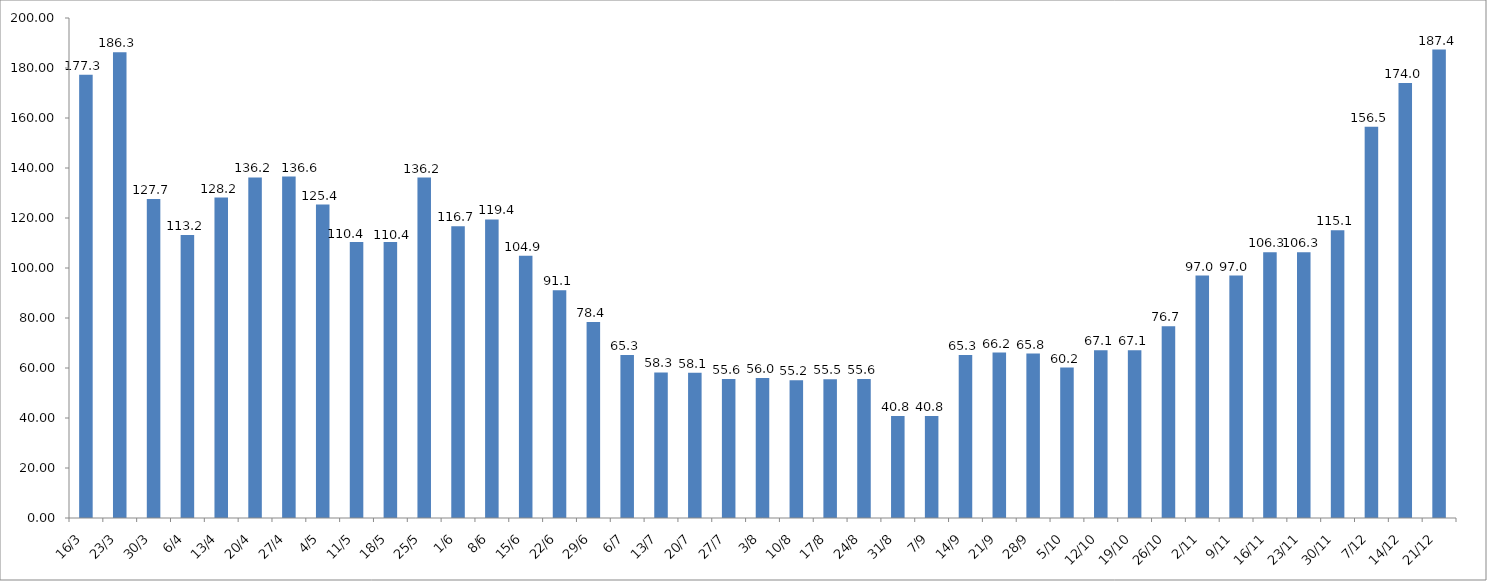
| Category | Series 0 |
|---|---|
| 2020-03-16 | 177.317 |
| 2020-03-23 | 186.317 |
| 2020-03-30 | 127.65 |
| 2020-04-06 | 113.167 |
| 2020-04-13 | 128.167 |
| 2020-04-20 | 136.233 |
| 2020-04-27 | 136.567 |
| 2020-05-04 | 125.392 |
| 2020-05-11 | 110.425 |
| 2020-05-18 | 110.425 |
| 2020-05-25 | 136.2 |
| 2020-06-01 | 116.658 |
| 2020-06-08 | 119.417 |
| 2020-06-15 | 104.917 |
| 2020-06-22 | 91.083 |
| 2020-06-29 | 78.358 |
| 2020-07-06 | 65.25 |
| 2020-07-13 | 58.25 |
| 2020-07-20 | 58.083 |
| 2020-07-27 | 55.583 |
| 2020-08-03 | 55.975 |
| 2020-08-10 | 55.15 |
| 2020-08-17 | 55.542 |
| 2020-08-24 | 55.625 |
| 2020-08-31 | 40.833 |
| 2020-09-07 | 40.833 |
| 2020-09-14 | 65.25 |
| 2020-09-21 | 66.2 |
| 2020-09-28 | 65.8 |
| 2020-10-05 | 60.167 |
| 2020-10-12 | 67.058 |
| 2020-10-19 | 67.058 |
| 2020-10-26 | 76.725 |
| 2020-11-02 | 96.992 |
| 2020-11-09 | 96.992 |
| 2020-11-16 | 106.333 |
| 2020-11-23 | 106.333 |
| 2020-11-30 | 115.083 |
| 2020-12-07 | 156.492 |
| 2020-12-14 | 173.983 |
| 2020-12-21 | 187.38 |